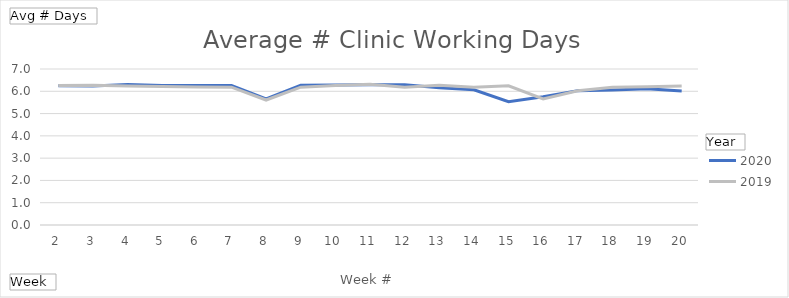
| Category | 2020 | 2019 |
|---|---|---|
| 2 | 6.245 | 6.255 |
| 3 | 6.235 | 6.275 |
| 4 | 6.304 | 6.235 |
| 5 | 6.265 | 6.216 |
| 6 | 6.265 | 6.196 |
| 7 | 6.255 | 6.186 |
| 8 | 5.657 | 5.608 |
| 9 | 6.275 | 6.186 |
| 10 | 6.284 | 6.265 |
| 11 | 6.294 | 6.314 |
| 12 | 6.294 | 6.186 |
| 13 | 6.157 | 6.275 |
| 14 | 6.069 | 6.186 |
| 15 | 5.529 | 6.245 |
| 16 | 5.755 | 5.657 |
| 17 | 6.029 | 6.02 |
| 18 | 6.059 | 6.186 |
| 19 | 6.119 | 6.206 |
| 20 | 6.01 | 6.235 |